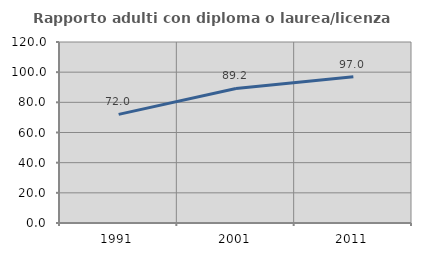
| Category | Rapporto adulti con diploma o laurea/licenza media  |
|---|---|
| 1991.0 | 72.024 |
| 2001.0 | 89.2 |
| 2011.0 | 96.99 |